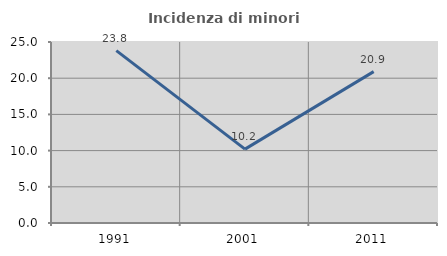
| Category | Incidenza di minori stranieri |
|---|---|
| 1991.0 | 23.81 |
| 2001.0 | 10.204 |
| 2011.0 | 20.909 |